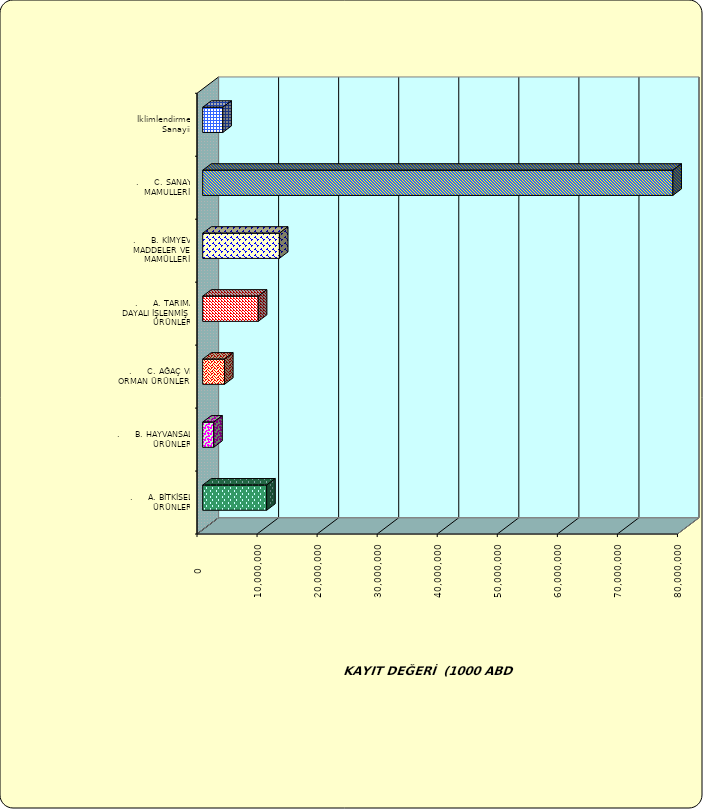
| Category | Series 0 |
|---|---|
| .     A. BİTKİSEL ÜRÜNLER | 10651264.567 |
| .     B. HAYVANSAL ÜRÜNLER | 1835266.062 |
| .     C. AĞAÇ VE ORMAN ÜRÜNLERİ | 3634314.192 |
| .     A. TARIMA DAYALI İŞLENMİŞ ÜRÜNLER | 9255304.998 |
| .     B. KİMYEVİ MADDELER VE MAMÜLLERİ | 12772718.858 |
| .     C. SANAYİ MAMULLERİ | 78287137.891 |
|  İklimlendirme Sanayii | 3350647.903 |